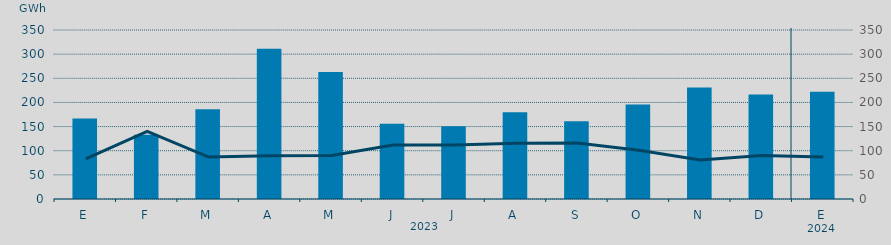
| Category | Energía a subir |
|---|---|
| E | 166.862 |
| F | 132.923 |
| M | 185.844 |
| A | 310.964 |
| M | 263.086 |
| J | 155.797 |
| J | 150.424 |
| A | 179.728 |
| S | 160.778 |
| O | 195.651 |
| N | 230.778 |
| D | 216.309 |
| E | 222.364 |